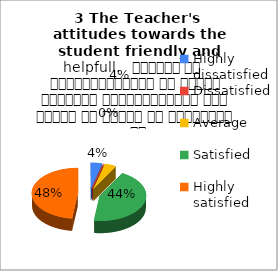
| Category | 3 The Teacher's  attitudes towards the student friendly and helpfull.   शिक्षक का विद्यार्थियों के प्रति व्यवहार मित्रतापूर्ण एवम सहयोग के भावना से परिपूर्ण था |
|---|---|
| Highly dissatisfied | 1 |
| Dissatisfied | 0 |
| Average | 1 |
| Satisfied | 11 |
| Highly satisfied | 12 |